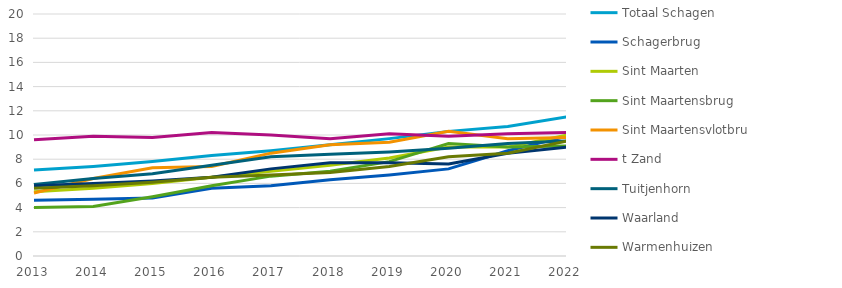
| Category | Totaal Schagen | Schagerbrug | Sint Maarten | Sint Maartensbrug | Sint Maartensvlotbrug | t Zand | Tuitjenhorn | Waarland | Warmenhuizen |
|---|---|---|---|---|---|---|---|---|---|
| 2013.0 | 7.1 | 4.6 | 5.3 | 4 | 5.2 | 9.6 | 5.9 | 5.8 | 5.6 |
| 2014.0 | 7.4 | 4.7 | 5.6 | 4.1 | 6.4 | 9.9 | 6.4 | 6 | 5.8 |
| 2015.0 | 7.8 | 4.8 | 6 | 4.9 | 7.3 | 9.8 | 6.8 | 6.2 | 6.1 |
| 2016.0 | 8.3 | 5.6 | 6.5 | 5.8 | 7.4 | 10.2 | 7.5 | 6.5 | 6.5 |
| 2017.0 | 8.7 | 5.8 | 7 | 6.6 | 8.5 | 10 | 8.2 | 7.2 | 6.7 |
| 2018.0 | 9.2 | 6.3 | 7.5 | 7 | 9.2 | 9.7 | 8.4 | 7.7 | 6.9 |
| 2019.0 | 9.7 | 6.7 | 8.1 | 7.8 | 9.4 | 10.1 | 8.6 | 7.7 | 7.4 |
| 2020.0 | 10.3 | 7.2 | 9 | 9.3 | 10.3 | 9.9 | 8.9 | 7.6 | 8.2 |
| 2021.0 | 10.7 | 8.7 | 9 | 9 | 9.7 | 10.1 | 9.3 | 8.5 | 8.5 |
| 2022.0 | 11.5 | 9.9 | 10 | 9.1 | 9.8 | 10.2 | 9.5 | 9 | 9.5 |